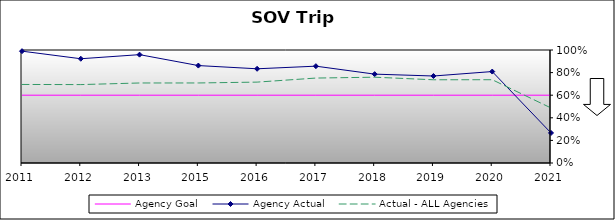
| Category | Agency Goal | Agency Actual | Actual - ALL Agencies |
|---|---|---|---|
| 2011.0 | 0.6 | 0.99 | 0.695 |
| 2012.0 | 0.6 | 0.923 | 0.694 |
| 2013.0 | 0.6 | 0.959 | 0.708 |
| 2015.0 | 0.6 | 0.862 | 0.708 |
| 2016.0 | 0.6 | 0.834 | 0.716 |
| 2017.0 | 0.6 | 0.857 | 0.752 |
| 2018.0 | 0.6 | 0.786 | 0.759 |
| 2019.0 | 0.6 | 0.77 | 0.736 |
| 2020.0 | 0.6 | 0.809 | 0.737 |
| 2021.0 | 0.6 | 0.266 | 0.487 |